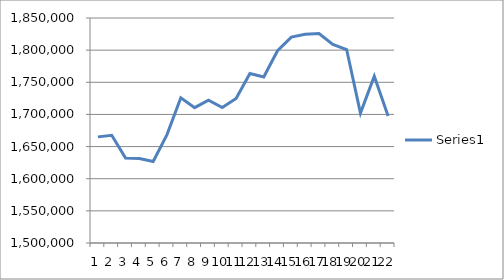
| Category | Series 0 |
|---|---|
| 0 | 1665095 |
| 1 | 1667560 |
| 2 | 1632024 |
| 3 | 1631496 |
| 4 | 1626740 |
| 5 | 1668660 |
| 6 | 1725916 |
| 7 | 1710513 |
| 8 | 1722139 |
| 9 | 1710707 |
| 10 | 1724899 |
| 11 | 1763678 |
| 12 | 1758132 |
| 13 | 1799127 |
| 14 | 1820269 |
| 15 | 1824792 |
| 16 | 1825763 |
| 17 | 1808893 |
| 18 | 1800966 |
| 19 | 1702064 |
| 20 | 1759390 |
| 21 | 1697660 |